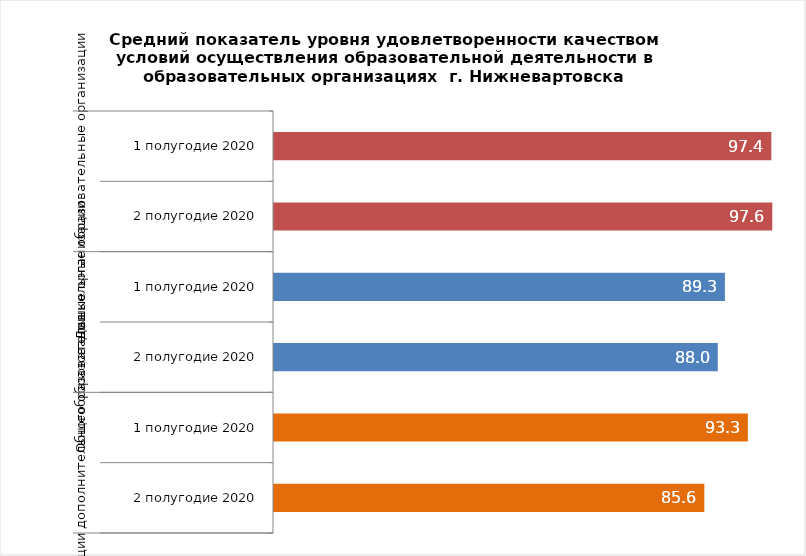
| Category | Series 0 |
|---|---|
| 0 | 97.422 |
| 1 | 97.592 |
| 2 | 89.263 |
| 3 | 88.01 |
| 4 | 93.297 |
| 5 | 85.645 |